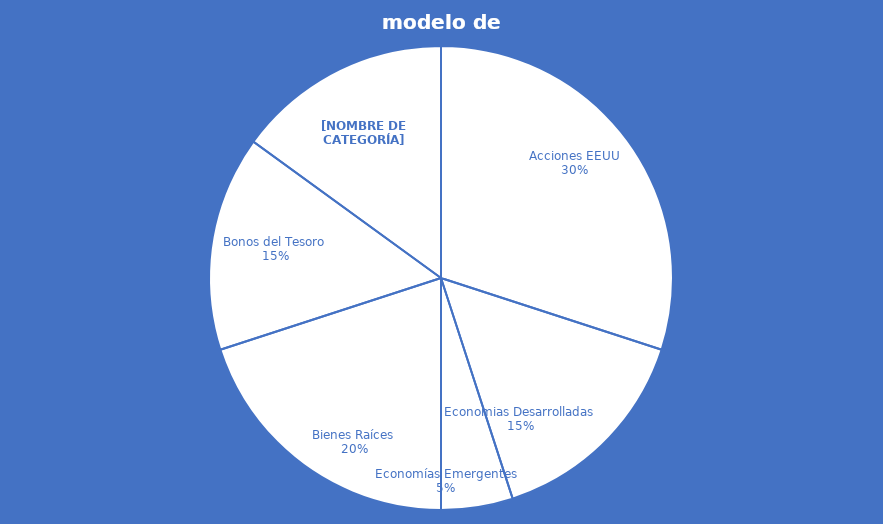
| Category | Series 0 |
|---|---|
| Acciones EEUU | 30 |
| Economias Desarrolladas | 15 |
| Economías Emergentes | 5 |
| Bienes Raíces | 20 |
| Bonos del Tesoro | 15 |
| Bonos Anti-inflación | 15 |